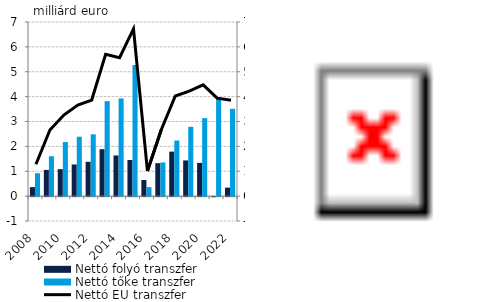
| Category | Nettó folyó transzfer | Nettó tőke transzfer |
|---|---|---|
| 2008.0 | 0.362 | 0.921 |
| 2009.0 | 1.055 | 1.603 |
| 2010.0 | 1.085 | 2.174 |
| 2011.0 | 1.273 | 2.387 |
| 2012.0 | 1.378 | 2.484 |
| 2013.0 | 1.887 | 3.817 |
| 2014.0 | 1.635 | 3.928 |
| 2015.0 | 1.452 | 5.271 |
| 2016.0 | 0.65 | 0.363 |
| 2017.0 | 1.325 | 1.353 |
| 2018.0 | 1.789 | 2.235 |
| 2019.0 | 1.435 | 2.787 |
| 2020.0 | 1.336 | 3.135 |
| 2021.0 | -0.006 | 3.945 |
| 2022.0 | 0.341 | 3.51 |